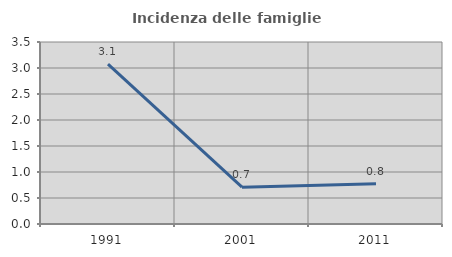
| Category | Incidenza delle famiglie numerose |
|---|---|
| 1991.0 | 3.075 |
| 2001.0 | 0.707 |
| 2011.0 | 0.776 |